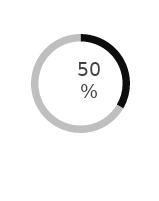
| Category | Series 0 |
|---|---|
| Männer | 0.501 |
| Prozent | 1 |